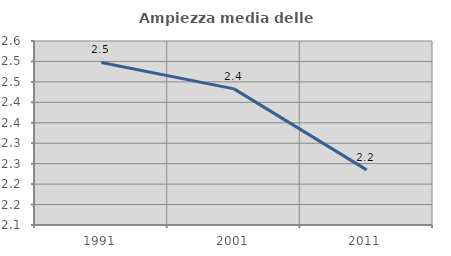
| Category | Ampiezza media delle famiglie |
|---|---|
| 1991.0 | 2.497 |
| 2001.0 | 2.433 |
| 2011.0 | 2.235 |